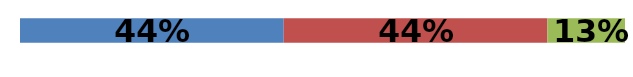
| Category | Series 0 | Series 1 | Series 2 |
|---|---|---|---|
| 0 | 0.436 | 0.436 | 0.128 |